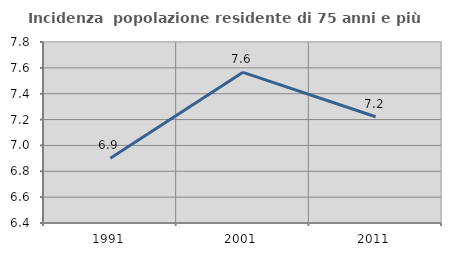
| Category | Incidenza  popolazione residente di 75 anni e più |
|---|---|
| 1991.0 | 6.901 |
| 2001.0 | 7.565 |
| 2011.0 | 7.221 |